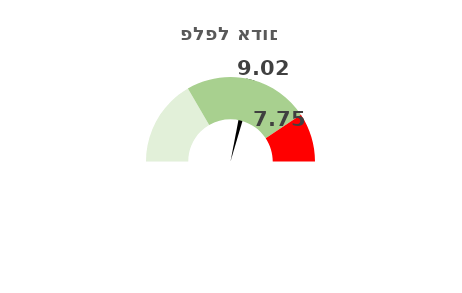
| Category | מיקום חוגה |
|---|---|
| 0 | 9.017 |
| 1 | 0.5 |
| 2 | 22.664 |